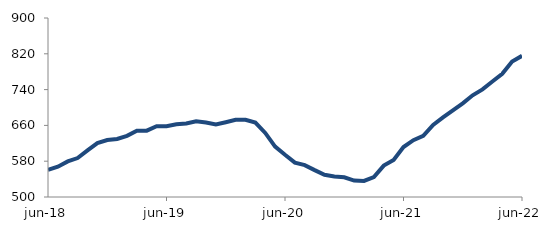
| Category | Series 0 |
|---|---|
| 2018-06-01 | 560.85 |
| 2018-07-01 | 567.827 |
| 2018-08-01 | 579.547 |
| 2018-09-01 | 587.097 |
| 2018-10-01 | 604.2 |
| 2018-11-01 | 620.436 |
| 2018-12-01 | 627.396 |
| 2019-01-01 | 629.794 |
| 2019-02-01 | 636.624 |
| 2019-03-01 | 648.17 |
| 2019-04-01 | 648.206 |
| 2019-05-01 | 658.035 |
| 2019-06-01 | 657.952 |
| 2019-07-01 | 662.49 |
| 2019-08-01 | 664.104 |
| 2019-09-01 | 669.196 |
| 2019-10-01 | 666.5 |
| 2019-11-01 | 662.174 |
| 2019-12-01 | 667.143 |
| 2020-01-01 | 672.455 |
| 2020-02-01 | 672.659 |
| 2020-03-01 | 666.213 |
| 2020-04-01 | 643.145 |
| 2020-05-01 | 612.572 |
| 2020-06-01 | 594.292 |
| 2020-07-01 | 576.858 |
| 2020-08-01 | 571.224 |
| 2020-09-01 | 560.032 |
| 2020-10-01 | 549.541 |
| 2020-11-01 | 545.982 |
| 2020-12-01 | 544.038 |
| 2021-01-01 | 536.772 |
| 2021-02-01 | 535.938 |
| 2021-03-01 | 544.717 |
| 2021-04-01 | 570.16 |
| 2021-05-01 | 582.981 |
| 2021-06-01 | 611.684 |
| 2021-07-01 | 627.037 |
| 2021-08-01 | 636.642 |
| 2021-09-01 | 661.114 |
| 2021-10-01 | 677.889 |
| 2021-11-01 | 693.389 |
| 2021-12-01 | 709.343 |
| 2022-01-01 | 727.31 |
| 2022-02-01 | 740.539 |
| 2022-03-01 | 758.027 |
| 2022-04-01 | 775.241 |
| 2022-05-01 | 802.956 |
| 2022-06-01 | 815.434 |